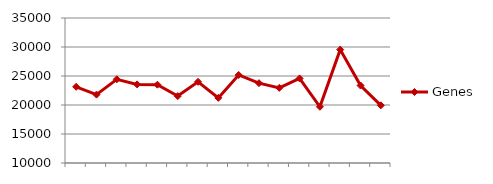
| Category | Genes |
|---|---|
|  | 23135 |
|  | 21793 |
|  | 24435 |
|  | 23553 |
|  | 23503 |
|  | 21537 |
|  | 24000 |
|  | 21228 |
|  | 25176 |
|  | 23766 |
|  | 22949 |
|  | 24584 |
|  | 19695 |
|  | 29546 |
|  | 23357 |
|  | 19943 |